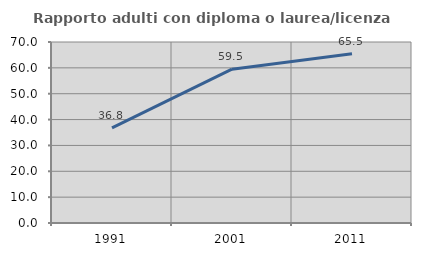
| Category | Rapporto adulti con diploma o laurea/licenza media  |
|---|---|
| 1991.0 | 36.761 |
| 2001.0 | 59.504 |
| 2011.0 | 65.472 |